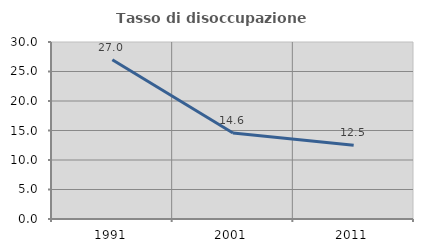
| Category | Tasso di disoccupazione giovanile  |
|---|---|
| 1991.0 | 27 |
| 2001.0 | 14.583 |
| 2011.0 | 12.5 |